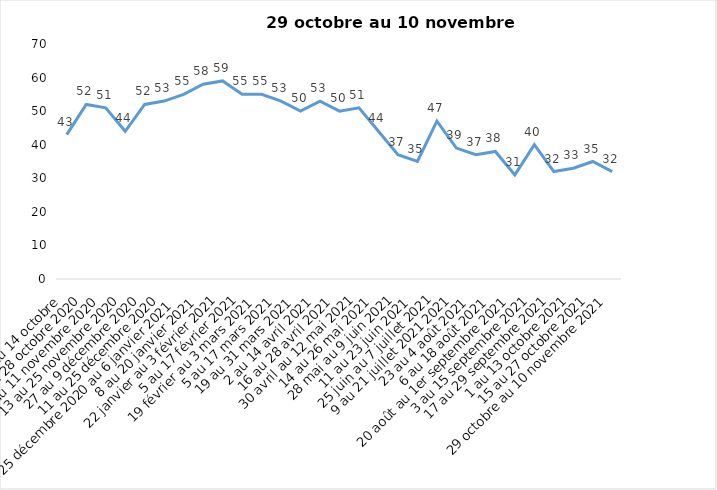
| Category | Toujours aux trois mesures |
|---|---|
| 2 au 14 octobre  | 43 |
| 16 au 28 octobre 2020 | 52 |
| 30 octobre au 11 novembre 2020 | 51 |
| 13 au 25 novembre 2020 | 44 |
| 27 au 9 décembre 2020 | 52 |
| 11 au 25 décembre 2020 | 53 |
| 25 décembre 2020 au 6 janvier 2021 | 55 |
| 8 au 20 janvier 2021 | 58 |
| 22 janvier au 3 février 2021 | 59 |
| 5 au 17 février 2021 | 55 |
| 19 février au 3 mars 2021 | 55 |
| 5 au 17 mars 2021 | 53 |
| 19 au 31 mars 2021 | 50 |
| 2 au 14 avril 2021 | 53 |
| 16 au 28 avril 2021 | 50 |
| 30 avril au 12 mai 2021 | 51 |
| 14 au 26 mai 2021 | 44 |
| 28 mai au 9 juin 2021 | 37 |
| 11 au 23 juin 2021 | 35 |
| 25 juin au 7 juillet 2021 | 47 |
| 9 au 21 juillet 2021 2021 | 39 |
| 23 au 4 août 2021 | 37 |
| 6 au 18 août 2021 | 38 |
| 20 août au 1er septembre 2021 | 31 |
| 3 au 15 septembre 2021 | 40 |
| 17 au 29 septembre 2021 | 32 |
| 1 au 13 octobre 2021 | 33 |
| 15 au 27 octobre 2021 | 35 |
| 29 octobre au 10 novembre 2021 | 32 |